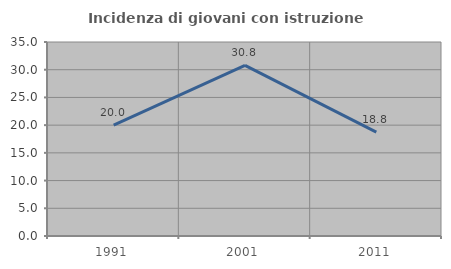
| Category | Incidenza di giovani con istruzione universitaria |
|---|---|
| 1991.0 | 20 |
| 2001.0 | 30.769 |
| 2011.0 | 18.75 |